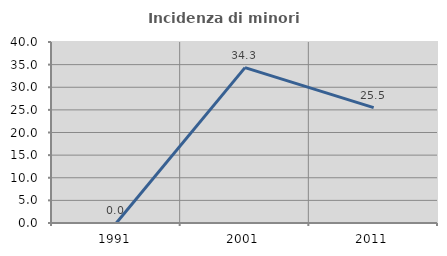
| Category | Incidenza di minori stranieri |
|---|---|
| 1991.0 | 0 |
| 2001.0 | 34.328 |
| 2011.0 | 25.49 |